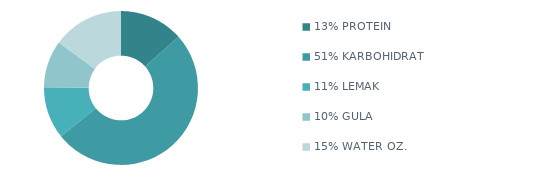
| Category | Series 0 |
|---|---|
| 13% PROTEIN | 915 |
| 51% KARBOHIDRAT | 3460 |
| 11% LEMAK | 745 |
| 10% GULA | 675 |
| 15% WATER OZ. | 1018 |